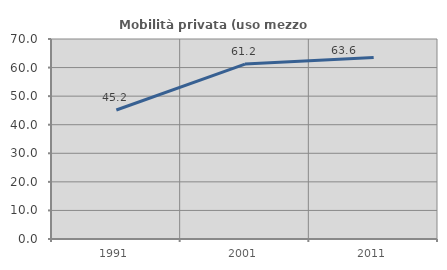
| Category | Mobilità privata (uso mezzo privato) |
|---|---|
| 1991.0 | 45.151 |
| 2001.0 | 61.209 |
| 2011.0 | 63.556 |